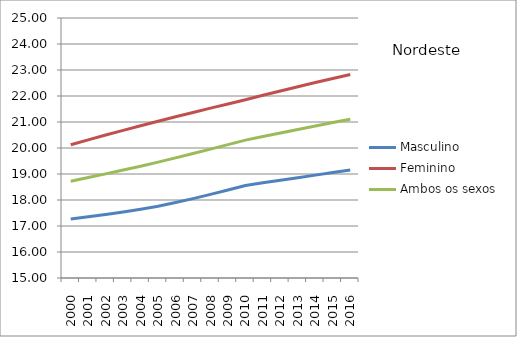
| Category | Masculino | Feminino | Ambos os sexos |
|---|---|---|---|
| 2000.0 | 17.269 | 20.127 | 18.72 |
| 2001.0 | 17.353 | 20.314 | 18.862 |
| 2002.0 | 17.441 | 20.499 | 19.005 |
| 2003.0 | 17.537 | 20.678 | 19.151 |
| 2004.0 | 17.643 | 20.855 | 19.3 |
| 2005.0 | 17.763 | 21.029 | 19.455 |
| 2006.0 | 17.902 | 21.2 | 19.619 |
| 2007.0 | 18.054 | 21.368 | 19.786 |
| 2008.0 | 18.217 | 21.533 | 19.957 |
| 2009.0 | 18.387 | 21.695 | 20.131 |
| 2010.0 | 18.561 | 21.855 | 20.303 |
| 2011.0 | 18.659 | 22.027 | 20.442 |
| 2012.0 | 18.758 | 22.195 | 20.579 |
| 2013.0 | 18.857 | 22.359 | 20.714 |
| 2014.0 | 18.956 | 22.519 | 20.847 |
| 2015.0 | 19.056 | 22.676 | 20.979 |
| 2016.0 | 19.156 | 22.829 | 21.108 |